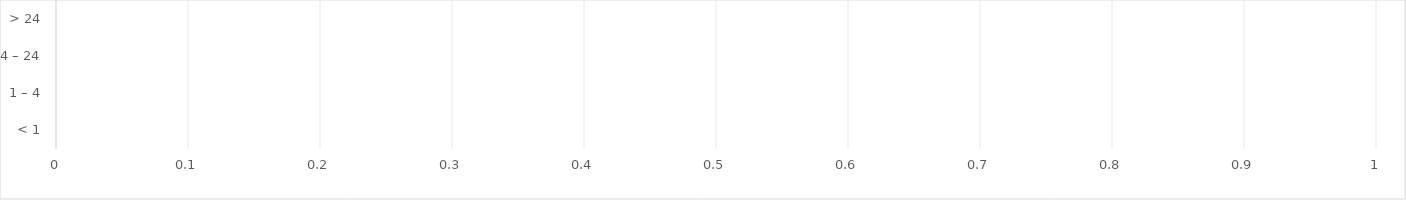
| Category | CALLS |
|---|---|
| < 1 | 0 |
| 1 – 4 | 0 |
| 4 – 24 | 0 |
| > 24 | 0 |